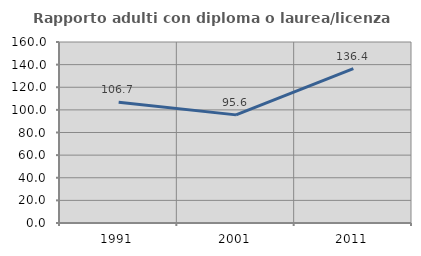
| Category | Rapporto adulti con diploma o laurea/licenza media  |
|---|---|
| 1991.0 | 106.742 |
| 2001.0 | 95.578 |
| 2011.0 | 136.396 |